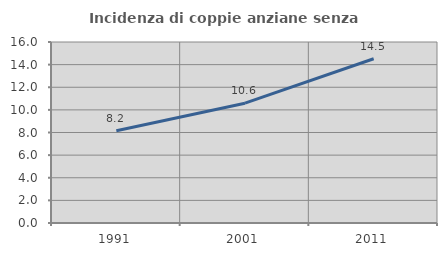
| Category | Incidenza di coppie anziane senza figli  |
|---|---|
| 1991.0 | 8.162 |
| 2001.0 | 10.591 |
| 2011.0 | 14.518 |